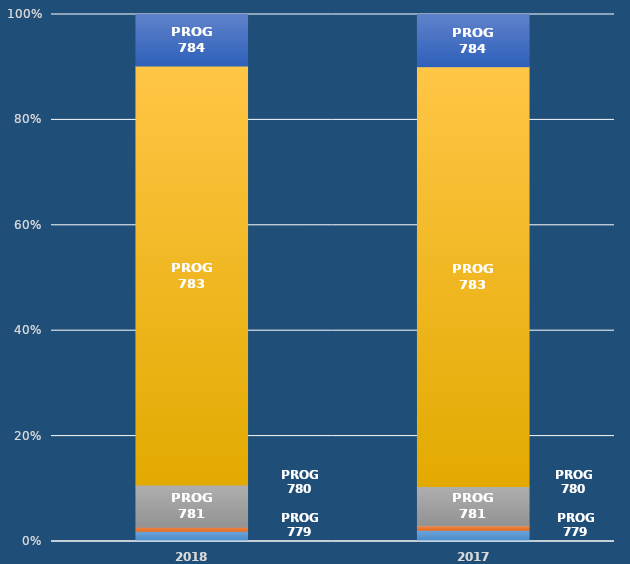
| Category | PROG 779 | PROG 780 | PROG 781 | PROG 783 | PROG 784 |
|---|---|---|---|---|---|
| 2018.0 | 0.019 | 0.008 | 0.08 | 0.795 | 0.098 |
| 2017.0 | 0.021 | 0.009 | 0.074 | 0.797 | 0.099 |